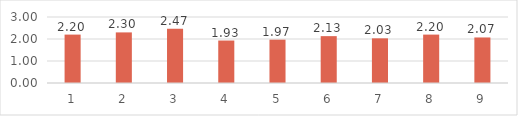
| Category | Series 0 |
|---|---|
| 0 | 2.2 |
| 1 | 2.3 |
| 2 | 2.47 |
| 3 | 1.93 |
| 4 | 1.97 |
| 5 | 2.13 |
| 6 | 2.03 |
| 7 | 2.2 |
| 8 | 2.07 |